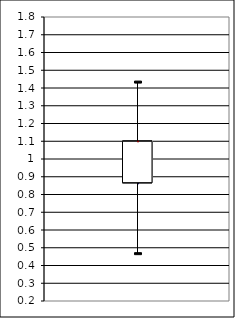
| Category | unteres Quartil | Minimum | arithmetisches Mittel | Median | Maximum | oberes Quartil |
|---|---|---|---|---|---|---|
| 0 | 0.867 | 0.467 | 1 | 1 | 1.433 | 1.1 |